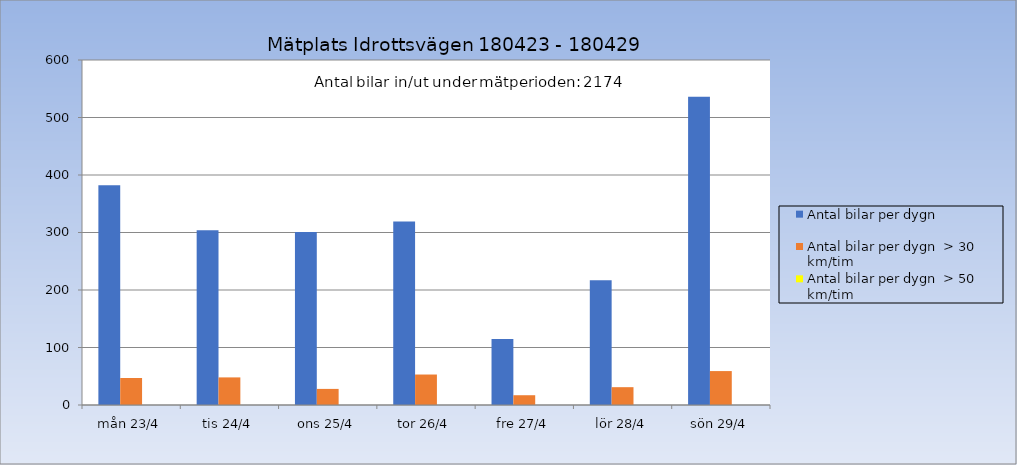
| Category | Antal bilar per dygn | Antal bilar per dygn  > 30 km/tim | Antal bilar per dygn  > 50 km/tim |
|---|---|---|---|
| mån 23/4 | 382 | 47 | 0 |
| tis 24/4 | 304 | 48 | 0 |
| ons 25/4 | 301 | 28 | 0 |
| tor 26/4 | 319 | 53 | 0 |
| fre 27/4 | 115 | 17 | 0 |
| lör 28/4 | 217 | 31 | 0 |
| sön 29/4 | 536 | 59 | 0 |